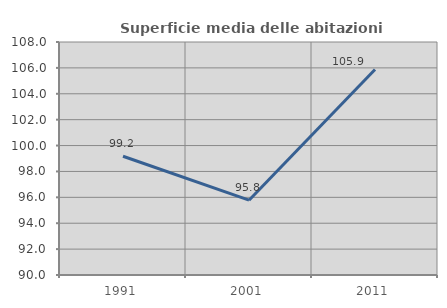
| Category | Superficie media delle abitazioni occupate |
|---|---|
| 1991.0 | 99.171 |
| 2001.0 | 95.779 |
| 2011.0 | 105.879 |